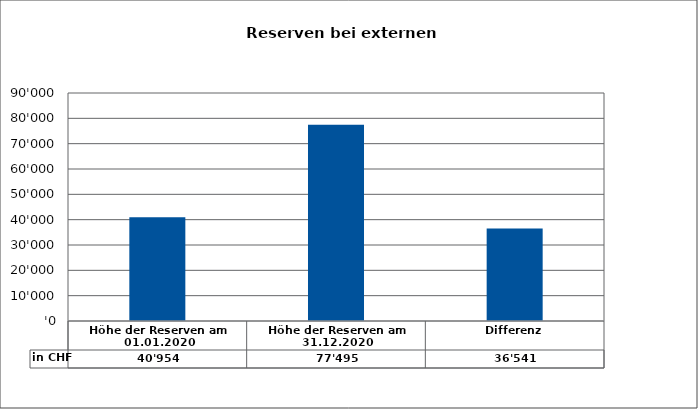
| Category | in CHF |
|---|---|
| Höhe der Reserven am 01.01.2020 | 40953.86 |
| Höhe der Reserven am 31.12.2020 | 77495 |
| Differenz | 36541.14 |